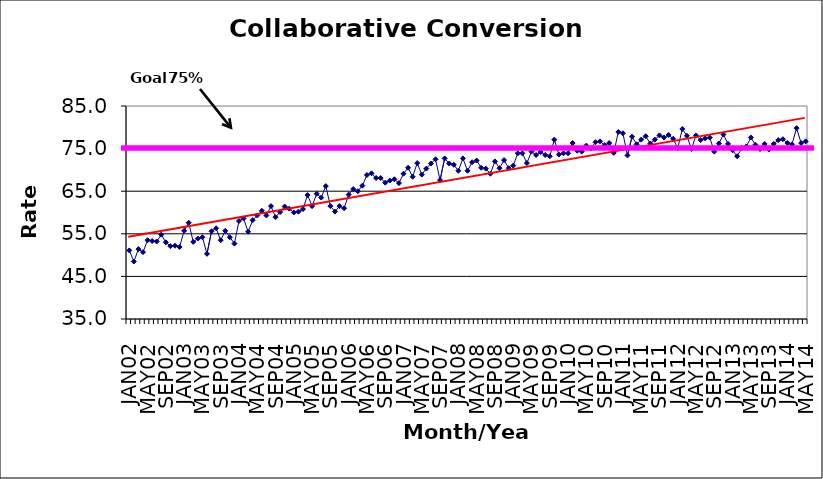
| Category | Series 0 |
|---|---|
| JAN02 | 51.1 |
| FEB02 | 48.5 |
| MAR02 | 51.4 |
| APR02 | 50.7 |
| MAY02 | 53.5 |
| JUN02 | 53.3 |
| JUL02 | 53.2 |
| AUG02 | 54.8 |
| SEP02 | 53 |
| OCT02 | 52.1 |
| NOV02 | 52.2 |
| DEC02 | 51.9 |
| JAN03 | 55.7 |
| FEB03 | 57.6 |
| MAR03 | 53.1 |
| APR03 | 53.9 |
| MAY03 | 54.2 |
| JUN03 | 50.3 |
| JUL03 | 55.6 |
| AUG03 | 56.3 |
| SEP03 | 53.5 |
| OCT03 | 55.7 |
| NOV03 | 54.2 |
| DEC03 | 52.7 |
| JAN04 | 58 |
| FEB04 | 58.6 |
| MAR04 | 55.5 |
| APR04 | 58.2 |
| MAY04 | 59.3 |
| JUN04 | 60.4 |
| JUL04 | 59.3 |
| AUG04 | 61.5 |
| SEP04 | 58.9 |
| OCT04 | 60.1 |
| NOV04 | 61.4 |
| DEC04 | 60.9 |
| JAN05 | 60 |
| FEB05 | 60.2 |
| MAR05 | 60.8 |
| APR05 | 64.1 |
| MAY05 | 61.5 |
| JUN05 | 64.4 |
| JUL05 | 63.5 |
| AUG05 | 66.2 |
| SEP05 | 61.5 |
| OCT05 | 60.2 |
| NOV05 | 61.5 |
| DEC05 | 61 |
| JAN06 | 64.2 |
| FEB06 | 65.5 |
| MAR06 | 65 |
| APR06 | 66.3 |
| MAY06 | 68.8 |
| JUN06 | 69.2 |
| JUL06 | 68.1 |
| AUG06 | 68.1 |
| SEP06 | 67 |
| OCT06 | 67.5 |
| NOV06 | 67.8 |
| DEC06 | 66.9 |
| JAN07 | 69.1 |
| FEB07 | 70.5 |
| MAR07 | 68.4 |
| APR07 | 71.6 |
| MAY07 | 68.9 |
| JUN07 | 70.3 |
| JUL07 | 71.5 |
| AUG07 | 72.5 |
| SEP07 | 67.6 |
| OCT07 | 72.7 |
| NOV07 | 71.5 |
| DEC07 | 71.2 |
| JAN08 | 69.8 |
| FEB08 | 72.7 |
| MAR08 | 69.8 |
| APR08 | 71.8 |
| MAY08 | 72.2 |
| JUN08 | 70.5 |
| JUL08 | 70.3 |
| AUG08 | 69.1 |
| SEP08 | 72 |
| OCT08 | 70.4 |
| NOV08 | 72.3 |
| DEC08 | 70.4 |
| JAN09 | 71 |
| FEB09 | 73.9 |
| MAR09 | 73.9 |
| APR09 | 71.6 |
| MAY09 | 74.3 |
| JUN09 | 73.5 |
| JUL09 | 74.2 |
| AUG09 | 73.5 |
| SEP09 | 73.2 |
| OCT09 | 77.1 |
| NOV09 | 73.6 |
| DEC09 | 73.9 |
| JAN10 | 73.9 |
| FEB10 | 76.3 |
| MAR10 | 74.5 |
| APR10 | 74.3 |
| MAY10 | 75.7 |
| JUN10 | 75 |
| JUL10 | 76.5 |
| AUG10 | 76.7 |
| SEP10 | 75.8 |
| OCT10 | 76.3 |
| NOV10 | 74 |
| DEC10 | 78.9 |
| JAN11 | 78.6 |
| FEB11 | 73.4 |
| MAR11 | 77.8 |
| APR11 | 76 |
| MAY11 | 77.1 |
| JUN11 | 77.9 |
| JUL11 | 76.2 |
| AUG11 | 77.1 |
| SEP11 | 78.1 |
| OCT11 | 77.6 |
| NOV11 | 78.2 |
| DEC11 | 77.3 |
| JAN12 | 75.1 |
| FEB12 | 79.6 |
| MAR12 | 78 |
| APR12 | 74.9 |
| MAY12 | 78.1 |
| JUN12 | 77 |
| JUL12 | 77.4 |
| AUG12 | 77.6 |
| SEP12 | 74.3 |
| OCT12 | 76.2 |
| NOV12 | 78.3 |
| DEC12 | 76.1 |
| JAN13 | 74.6 |
| FEB13 | 73.2 |
| MAR13 | 75.1 |
| APR13 | 75.5 |
| MAY13 | 77.6 |
| JUN13 | 75.9 |
| JUL13 | 74.9 |
| AUG13 | 76.1 |
| SEP13 | 74.8 |
| OCT13 | 76.1 |
| NOV13 | 77 |
| DEC13 | 77.2 |
| JAN14 | 76.3 |
| FEB14 | 76 |
| MAR14 | 79.8 |
| APR14 | 76.3 |
| MAY14 | 76.7 |